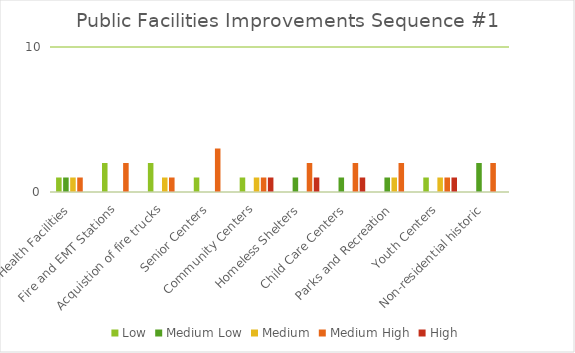
| Category | Low | Medium Low | Medium | Medium High | High |
|---|---|---|---|---|---|
| Health Facilities | 1 | 1 | 1 | 1 | 0 |
| Fire and EMT Stations | 2 | 0 | 0 | 2 | 0 |
| Acquistion of fire trucks | 2 | 0 | 1 | 1 | 0 |
| Senior Centers | 1 | 0 | 0 | 3 | 0 |
| Community Centers | 1 | 0 | 1 | 1 | 1 |
| Homeless Shelters | 0 | 1 | 0 | 2 | 1 |
| Child Care Centers | 0 | 1 | 0 | 2 | 1 |
| Parks and Recreation | 0 | 1 | 1 | 2 | 0 |
| Youth Centers | 1 | 0 | 1 | 1 | 1 |
| Non-residential historic | 0 | 2 | 0 | 2 | 0 |